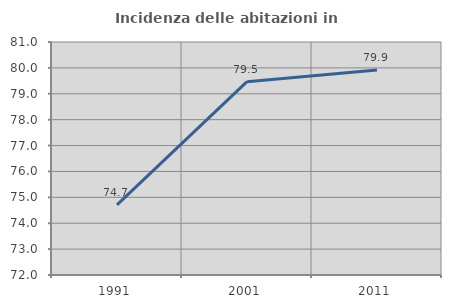
| Category | Incidenza delle abitazioni in proprietà  |
|---|---|
| 1991.0 | 74.71 |
| 2001.0 | 79.468 |
| 2011.0 | 79.919 |